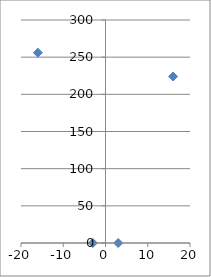
| Category | Series 0 |
|---|---|
| -3.0 | 0 |
| 3.0 | 0 |
| -16.0 | 256 |
| 16.0 | 224 |